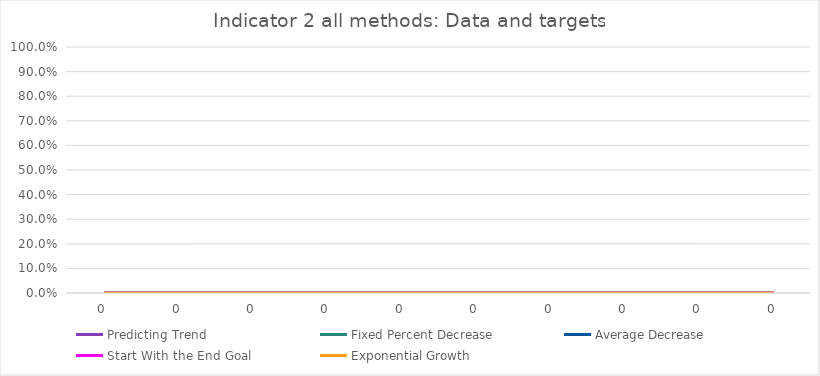
| Category | Predicting Trend | Fixed Percent Decrease | Average Decrease | Start With the End Goal | Exponential Growth |
|---|---|---|---|---|---|
| 0.0 | 0 | 0 | 0 | 0 | 0 |
| 0.0 | 0 | 0 | 0 | 0 | 0 |
| 0.0 | 0 | 0 | 0 | 0 | 0 |
| 0.0 | 0 | 0 | 0 | 0 | 0 |
| 0.0 | 0 | 0 | 0 | 0 | 0 |
| 0.0 | 0 | 0 | 0 | 0 | 0 |
| 0.0 | 0 | 0 | 0 | 0 | 0 |
| 0.0 | 0 | 0 | 0 | 0 | 0 |
| 0.0 | 0 | 0 | 0 | 0 | 0 |
| 0.0 | 0 | 0 | 0 | 0 | 0 |